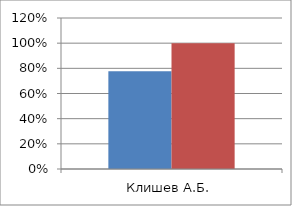
| Category | Series 0 | 2 |
|---|---|---|
| Клишев А.Б. | 0.776 | 1 |